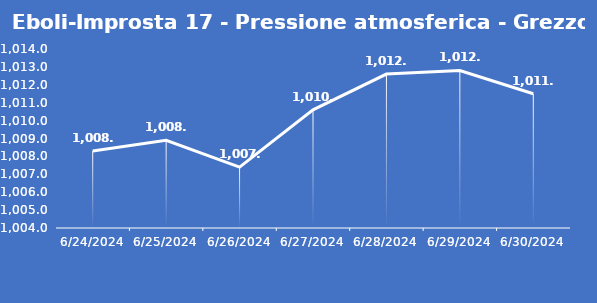
| Category | Eboli-Improsta 17 - Pressione atmosferica - Grezzo (hPa) |
|---|---|
| 6/24/24 | 1008.3 |
| 6/25/24 | 1008.9 |
| 6/26/24 | 1007.4 |
| 6/27/24 | 1010.6 |
| 6/28/24 | 1012.6 |
| 6/29/24 | 1012.8 |
| 6/30/24 | 1011.5 |